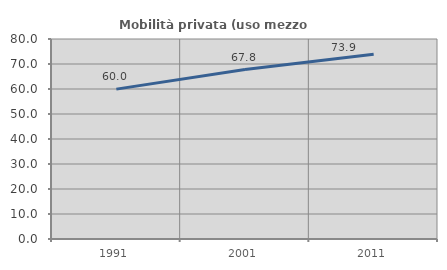
| Category | Mobilità privata (uso mezzo privato) |
|---|---|
| 1991.0 | 59.956 |
| 2001.0 | 67.798 |
| 2011.0 | 73.856 |